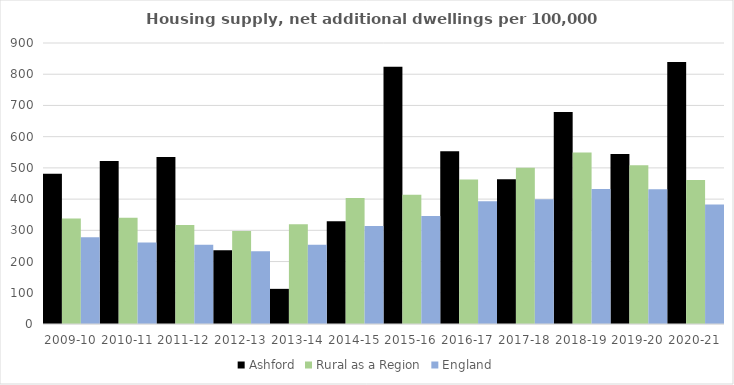
| Category | Ashford | Rural as a Region | England |
|---|---|---|---|
| 2009-10 | 481.529 | 337.852 | 277.548 |
| 2010-11 | 522.419 | 340.105 | 260.994 |
| 2011-12 | 534.606 | 317.04 | 254.007 |
| 2012-13 | 236.414 | 297.763 | 233.153 |
| 2013-14 | 112.587 | 319.835 | 253.602 |
| 2014-15 | 328.843 | 403.796 | 314.256 |
| 2015-16 | 823.881 | 414.091 | 346.154 |
| 2016-17 | 552.947 | 463.209 | 393.256 |
| 2017-18 | 463.431 | 500.68 | 399.646 |
| 2018-19 | 679.141 | 549.491 | 432.099 |
| 2019-20 | 544.481 | 508.493 | 431.187 |
| 2020-21 | 838.816 | 461.114 | 382.827 |